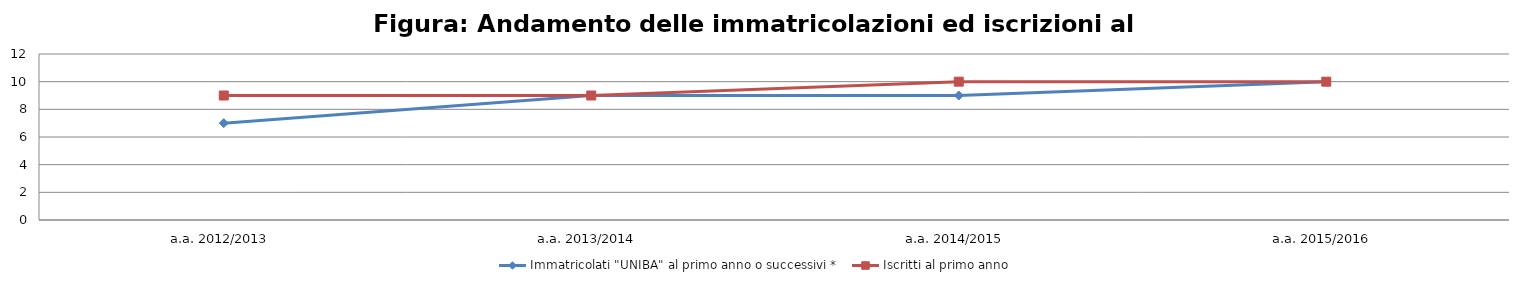
| Category | Immatricolati "UNIBA" al primo anno o successivi * | Iscritti al primo anno  |
|---|---|---|
| a.a. 2012/2013 | 7 | 9 |
| a.a. 2013/2014 | 9 | 9 |
| a.a. 2014/2015 | 9 | 10 |
| a.a. 2015/2016 | 10 | 10 |